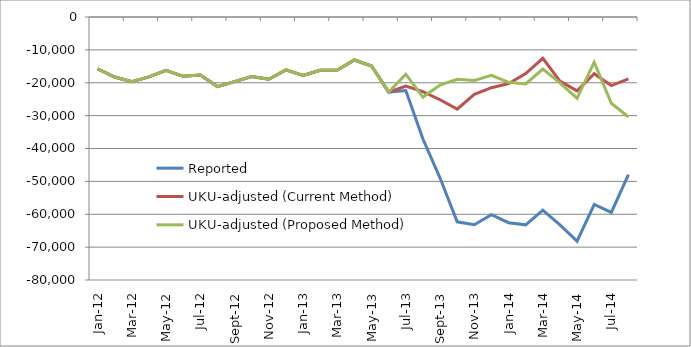
| Category | Reported | UKU-adjusted (Current Method) | UKU-adjusted (Proposed Method) |
|---|---|---|---|
| 2012-01-01 | -15758 | -15758 | -15758 |
| 2012-02-01 | -18247 | -18247 | -18247 |
| 2012-03-01 | -19702 | -19702 | -19702 |
| 2012-04-01 | -18218 | -18218 | -18218 |
| 2012-05-01 | -16223 | -16223 | -16223 |
| 2012-06-01 | -18041 | -18041 | -18041 |
| 2012-07-01 | -17648 | -17648 | -17648 |
| 2012-08-01 | -21176 | -21176 | -21176 |
| 2012-09-01 | -19670 | -19670 | -19670 |
| 2012-10-01 | -18125 | -18125 | -18125 |
| 2012-11-01 | -18937 | -18937 | -18937 |
| 2012-12-01 | -16092 | -16092 | -16092 |
| 2013-01-01 | -17801 | -17801 | -17801 |
| 2013-02-01 | -16205 | -16205 | -16205 |
| 2013-03-01 | -16137 | -16137 | -16137 |
| 2013-04-01 | -13079 | -13079 | -13079 |
| 2013-05-01 | -14904 | -14904 | -14904 |
| 2013-06-01 | -22835 | -22835 | -22835 |
| 2013-07-01 | -22354 | -20984.511 | -17401 |
| 2013-08-01 | -37123 | -22676.437 | -24358 |
| 2013-09-01 | -48996 | -25171.311 | -20685 |
| 2013-10-01 | -62296 | -28025.99 | -18958 |
| 2013-11-01 | -63179 | -23533.865 | -19284 |
| 2013-12-01 | -60149 | -21499.69 | -17715.333 |
| 2014-01-01 | -62572 | -20287.356 | -19853.333 |
| 2014-02-01 | -63224 | -17224.893 | -20381.333 |
| 2014-03-01 | -58744 | -12554.675 | -15836.333 |
| 2014-04-01 | -63234 | -19480.062 | -20042.333 |
| 2014-05-01 | -68191 | -22455.549 | -24759.333 |
| 2014-06-01 | -57038 | -17260.99 | -13731.833 |
| 2014-07-01 | -59439 | -20856.993 | -26236.333 |
| 2014-08-01 | -47943 | -18822.13 | -30425.333 |